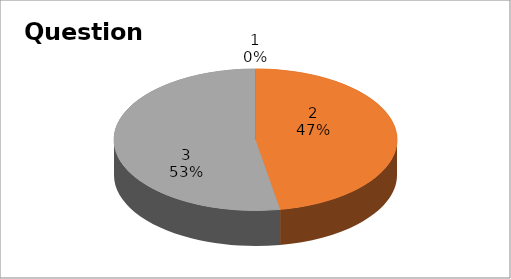
| Category | Series 0 |
|---|---|
| 0 | 0 |
| 1 | 17 |
| 2 | 19 |